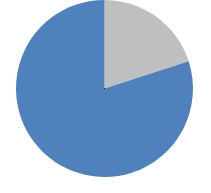
| Category | Kör |
|---|---|
| 0 | 20 |
| 1 | 80 |